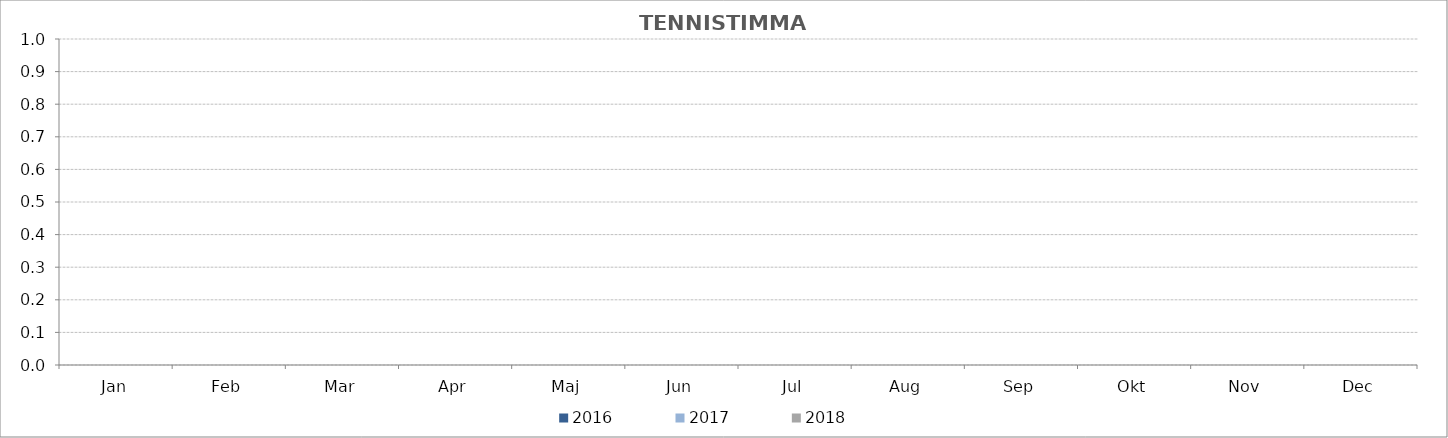
| Category | 2014 | 2015 | 2016 | 2017 | 2018 |
|---|---|---|---|---|---|
| Jan |  |  | 0 | 0 | 0 |
| Feb |  |  | 0 | 0 | 0 |
| Mar |  |  | 0 | 0 | 0 |
| Apr |  |  | 0 | 0 | 0 |
| Maj |  |  | 0 | 0 | 0 |
| Jun |  |  | 0 | 0 | 0 |
| Jul |  |  | 0 | 0 | 0 |
| Aug |  |  | 0 | 0 | 0 |
| Sep |  |  | 0 | 0 | 0 |
| Okt |  |  | 0 | 0 | 0 |
| Nov |  |  | 0 | 0 | 0 |
| Dec |  |  | 0 | 0 | 0 |